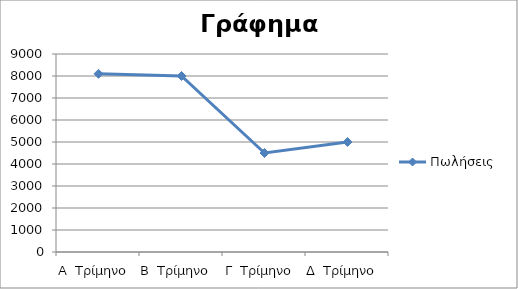
| Category | Πωλήσεις  |
|---|---|
| Α  Τρίμηνο  | 8100 |
| Β  Τρίμηνο  | 8000 |
| Γ  Τρίμηνο  | 4500 |
| Δ  Τρίμηνο  | 5000 |